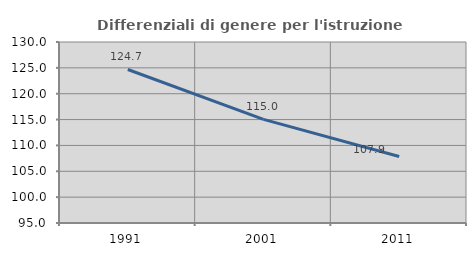
| Category | Differenziali di genere per l'istruzione superiore |
|---|---|
| 1991.0 | 124.685 |
| 2001.0 | 115.047 |
| 2011.0 | 107.87 |